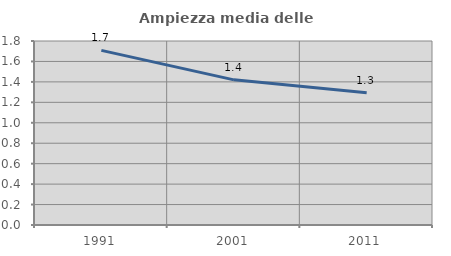
| Category | Ampiezza media delle famiglie |
|---|---|
| 1991.0 | 1.708 |
| 2001.0 | 1.42 |
| 2011.0 | 1.294 |